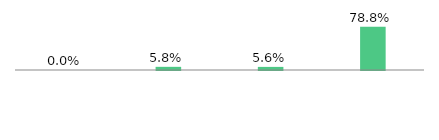
| Category | Series 1 |
|---|---|
| Absolute Deposit | 0 |
| CASA Deposit | 0.058 |
| Average Deposit | 0.056 |
| Weekly Deposit  10-09-2015 | 0.788 |